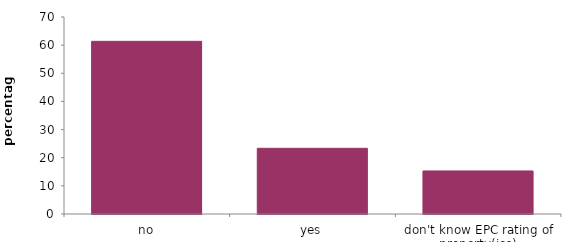
| Category | Series 0 |
|---|---|
| no | 61.361 |
| yes | 23.342 |
| don't know EPC rating of property(ies) | 15.297 |